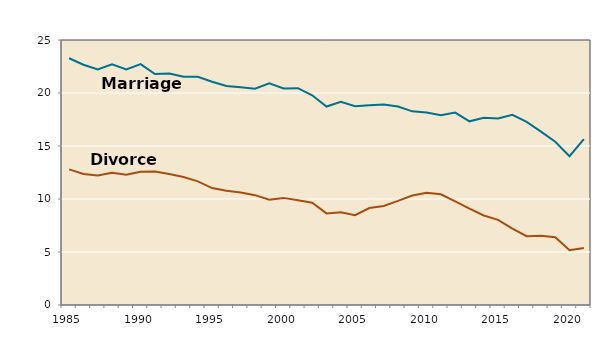
| Category | Marriages | Divorces |
|---|---|---|
| 1985.0 | 23281 | 12794 |
| 1986.0 | 22667 | 12364 |
| 1987.0 | 22220 | 12218 |
| 1988.0 | 22705 | 12475 |
| 1989.0 | 22214 | 12296 |
| 1990.0 | 22720 | 12580 |
| 1991.0 | 21786 | 12590 |
| 1992.0 | 21845 | 12365 |
| 1993.0 | 21527 | 12068 |
| 1994.0 | 21524 | 11659 |
| 1995.0 | 21057 | 11029 |
| 1996.0 | 20657 | 10779 |
| 1997.0 | 20537 | 10618 |
| 1998.0 | 20403 | 10363 |
| 1999.0 | 20905 | 9926 |
| 2000.0 | 20426 | 10105 |
| 2001.0 | 20457 | 9885 |
| 2002.0 | 19783 | 9645 |
| 2003.0 | 18722 | 8644 |
| 2004.0 | 19174 | 8759 |
| 2005.0 | 18745 | 8476 |
| 2006.0 | 18836 | 9145 |
| 2007.0 | 18910 | 9347 |
| 2008.0 | 18717 | 9818 |
| 2009.0 | 18268 | 10333 |
| 2010.0 | 18150 | 10579 |
| 2011.0 | 17897 | 10445 |
| 2012.0 | 18154 | 9782 |
| 2013.0 | 17328 | 9085 |
| 2014.0 | 17655 | 8441 |
| 2015.0 | 17595 | 8036 |
| 2016.0 | 17948 | 7198 |
| 2017.0 | 17274 | 6494 |
| 2018.0 | 16362 | 6538 |
| 2019.0 | 15403 | 6398 |
| 2020.0 | 14038 | 5169 |
| 2021.0 | 15656 | 5368 |